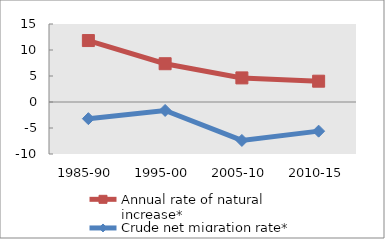
| Category | Annual rate of natural increase* | Crude net migration rate* |
|---|---|---|
| 1985-90 | 11.816 | -3.205 |
| 1995-00 | 7.361 | -1.627 |
| 2005-10 | 4.635 | -7.391 |
| 2010-15 | 4.002 | -5.604 |